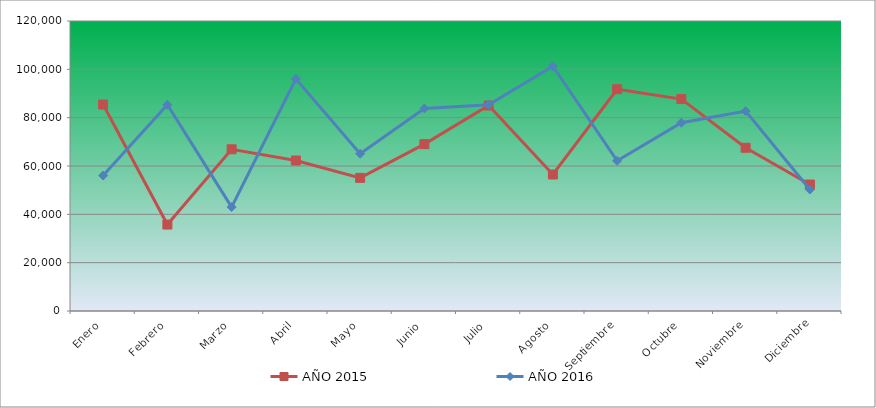
| Category | AÑO 2015 | AÑO 2016 |
|---|---|---|
| Enero | 85436.264 | 56061.503 |
| Febrero | 35765.451 | 85342.72 |
| Marzo | 66920.733 | 42990.192 |
| Abril | 62277.581 | 96062.446 |
| Mayo | 55101.479 | 65080.476 |
| Junio | 69053.386 | 83831.037 |
| Julio | 85027.688 | 85324.374 |
| Agosto | 56477.759 | 101303.792 |
| Septiembre | 91764.019 | 62129.048 |
| Octubre | 87700.022 | 77921.352 |
| Noviembre | 67551.936 | 82723.413 |
| Diciembre | 52348.086 | 50255.14 |